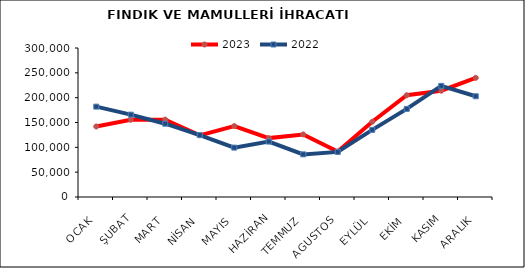
| Category | 2023 | 2022 |
|---|---|---|
| OCAK | 141954.896 | 181950.724 |
| ŞUBAT | 155574.245 | 165835.788 |
| MART | 155777.835 | 147564.067 |
| NİSAN | 124195.919 | 124714.679 |
| MAYIS | 142783.858 | 99421.29 |
| HAZİRAN | 118585.453 | 111564.361 |
| TEMMUZ | 125970.497 | 85829.991 |
| AGUSTOS | 91490.292 | 90782.419 |
| EYLÜL | 151500.11 | 135250.189 |
| EKİM | 204934.442 | 177423.311 |
| KASIM | 214026.524 | 223769.94 |
| ARALIK | 239941.346 | 202818.226 |